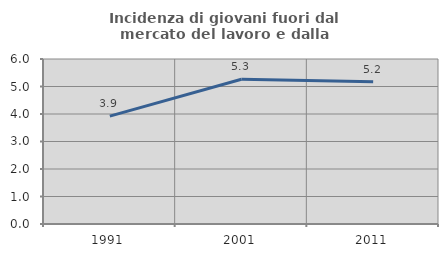
| Category | Incidenza di giovani fuori dal mercato del lavoro e dalla formazione  |
|---|---|
| 1991.0 | 3.922 |
| 2001.0 | 5.263 |
| 2011.0 | 5.172 |